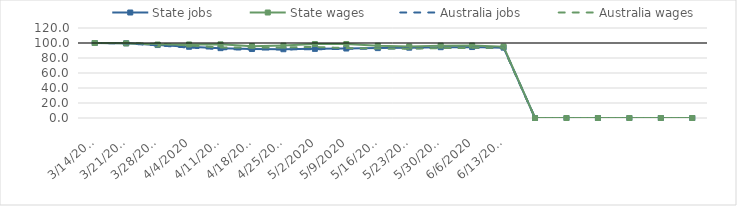
| Category | State jobs | State wages | Australia jobs | Australia wages |
|---|---|---|---|---|
| 14/03/2020 | 100 | 100 | 100 | 100 |
| 21/03/2020 | 99.579 | 99.528 | 99.495 | 100.113 |
| 28/03/2020 | 97.261 | 97.95 | 96.817 | 98.771 |
| 04/04/2020 | 94.967 | 98.062 | 93.908 | 96.774 |
| 11/04/2020 | 93.141 | 98.198 | 91.822 | 94.06 |
| 18/04/2020 | 91.967 | 95.811 | 91.153 | 93.831 |
| 25/04/2020 | 91.676 | 96.525 | 91.399 | 94.154 |
| 02/05/2020 | 92.18 | 98.571 | 91.732 | 94.697 |
| 09/05/2020 | 92.632 | 98.61 | 92.161 | 93.23 |
| 16/05/2020 | 93.181 | 96.363 | 92.673 | 92.722 |
| 23/05/2020 | 93.759 | 95.323 | 92.969 | 92.453 |
| 30/05/2020 | 94.401 | 96.5 | 93.509 | 93.187 |
| 06/06/2020 | 94.613 | 96.59 | 93.654 | 93.503 |
| 13/06/2020 | 93.833 | 95.194 | 93.635 | 93.681 |